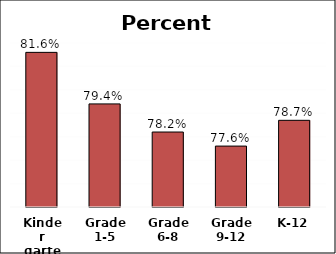
| Category | Series 0 |
|---|---|
| Kinder garten | 0.816 |
| Grade 1-5 | 0.794 |
| Grade 6-8 | 0.782 |
| Grade 9-12 | 0.776 |
| K-12 | 0.787 |